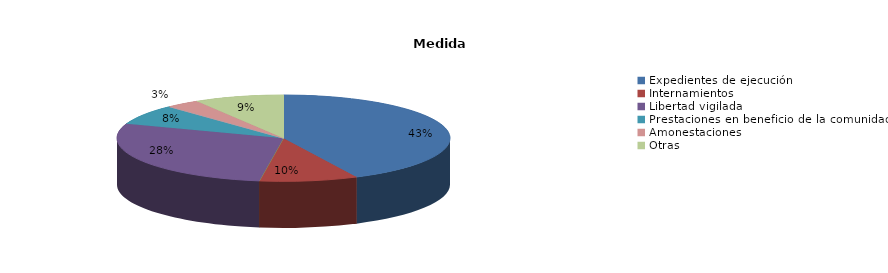
| Category | Series 0 |
|---|---|
| Expedientes de ejecución | 157 |
| Internamientos | 35 |
| Permanencias de fines de semana | 0 |
| Libertad vigilada | 103 |
| Prestaciones en beneficio de la comunidad | 28 |
| Privación de permisos y licencias | 0 |
| Convivencia Familiar Educativa | 0 |
| Amonestaciones | 12 |
| Otras | 32 |